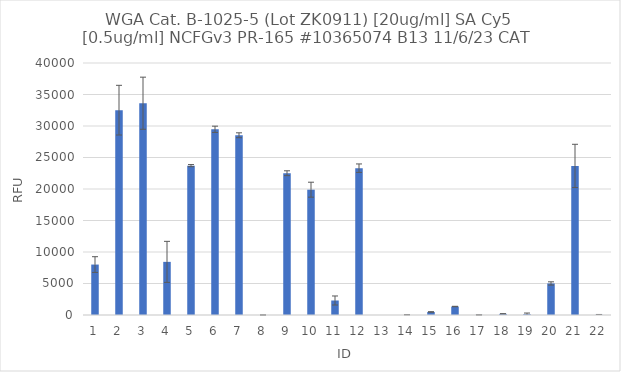
| Category | RFU |
|---|---|
| 0 | 8008 |
| 1 | 32513 |
| 2 | 33619 |
| 3 | 8435 |
| 4 | 23707.25 |
| 5 | 29477.5 |
| 6 | 28528.75 |
| 7 | 5.25 |
| 8 | 22504 |
| 9 | 19890.75 |
| 10 | 2302.75 |
| 11 | 23307 |
| 12 | -5 |
| 13 | -26.75 |
| 14 | 483 |
| 15 | 1346 |
| 16 | 20 |
| 17 | 184 |
| 18 | 126 |
| 19 | 5007.75 |
| 20 | 23662 |
| 21 | 40.5 |